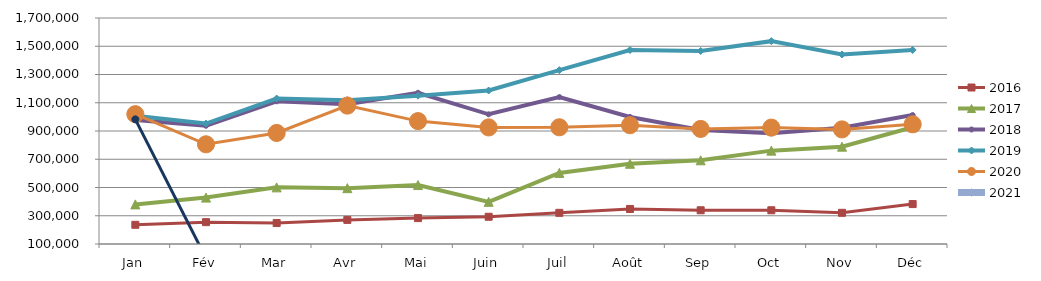
| Category | 2015 | 2016 | 2017 | 2018 | 2019 | 2020 | 2021 |
|---|---|---|---|---|---|---|---|
| Jan |  | 235903.093 | 380222.25 | 978468.279 | 1007982.373 | 1019103.465 | 982555.093 |
| Fév |  | 254650.591 | 428502.997 | 937137.209 | 952616.766 | 805837.355 | 0 |
| Mar |  | 248425.98 | 500955.694 | 1110199.711 | 1129815.679 | 886115.696 | 0 |
| Avr |  | 270687.752 | 495255.535 | 1090229.308 | 1118398.221 | 1079723.465 | 0 |
| Mai |  | 283507.34 | 517298.538 | 1170512.154 | 1150217.455 | 970040.088 | 0 |
| Juin |  | 292820.053 | 398427.247 | 1018295.812 | 1186623.687 | 925406.896 | 0 |
| Juil |  | 320615.91 | 603419.402 | 1140133.118 | 1330812.699 | 926286.755 | 0 |
| Août |  | 348014.816 | 667973.667 | 999343.146 | 1473280.035 | 941195.84 | 0 |
| Sep |  | 338807.949 | 692403.495 | 907808.882 | 1466448.158 | 914678.196 | 0 |
| Oct |  | 338820.212 | 760969.174 | 883825.979 | 1536100.268 | 923984.732 | 0 |
| Nov |  | 320858.147 | 789037.665 | 922678.039 | 1441770.199 | 911296.416 | 0 |
| Déc |  | 382727.181 | 926372.399 | 1012620.724 | 1473565.92 | 947568.113 | 0 |